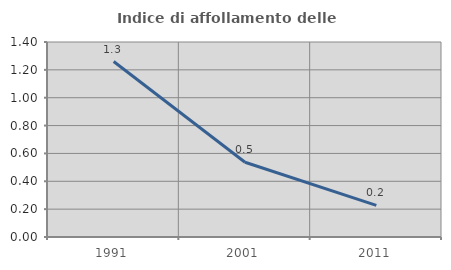
| Category | Indice di affollamento delle abitazioni  |
|---|---|
| 1991.0 | 1.26 |
| 2001.0 | 0.537 |
| 2011.0 | 0.227 |